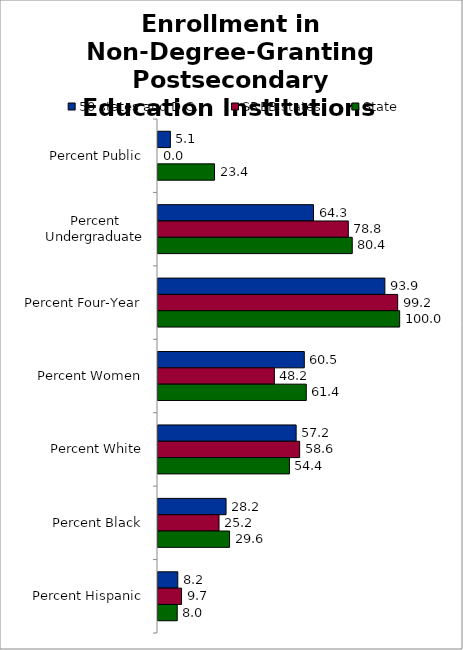
| Category | 50 states and D.C. | SREB states | State |
|---|---|---|---|
| Percent Public | 5.126 | 0 | 23.392 |
| Percent Undergraduate | 64.347 | 78.754 | 80.381 |
| Percent Four-Year | 93.874 | 99.177 | 100 |
| Percent Women | 60.542 | 48.15 | 61.36 |
| Percent White | 57.165 | 58.615 | 54.391 |
| Percent Black | 28.161 | 25.249 | 29.612 |
| Percent Hispanic | 8.191 | 9.738 | 7.958 |